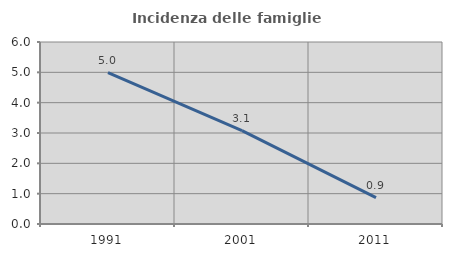
| Category | Incidenza delle famiglie numerose |
|---|---|
| 1991.0 | 4.989 |
| 2001.0 | 3.081 |
| 2011.0 | 0.871 |